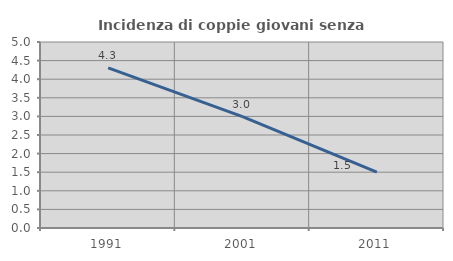
| Category | Incidenza di coppie giovani senza figli |
|---|---|
| 1991.0 | 4.303 |
| 2001.0 | 2.993 |
| 2011.0 | 1.505 |